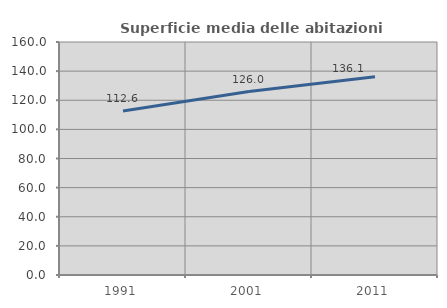
| Category | Superficie media delle abitazioni occupate |
|---|---|
| 1991.0 | 112.6 |
| 2001.0 | 125.958 |
| 2011.0 | 136.083 |